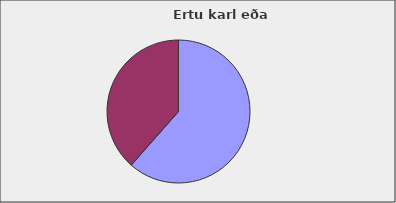
| Category | Series 0 |
|---|---|
| Karl | 0.615 |
| Kona | 0.385 |